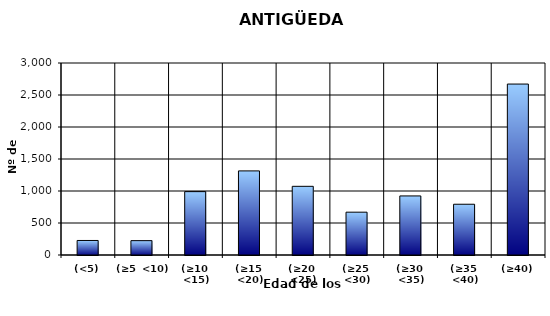
| Category | (<5) |
|---|---|
| (<5) | 227 |
| (≥5  <10) | 224 |
| (≥10  <15) | 990 |
| (≥15  <20) | 1314 |
| (≥20  <25) | 1073 |
| (≥25  <30) | 669 |
| (≥30  <35) | 923 |
| (≥35  <40) | 793 |
| (≥40) | 2671 |